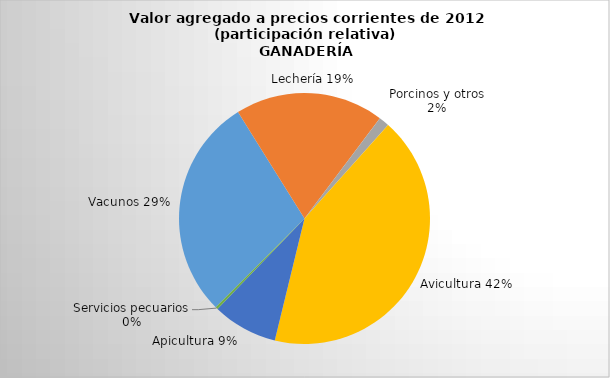
| Category | Series 0 |
|---|---|
| Vacunos | 34.875 |
| Lechería | 23.337 |
| Porcinos y otros | 1.647 |
| Avicultura | 51.452 |
| Apicultura | 10.226 |
| Servicios pecuarios | 0.366 |